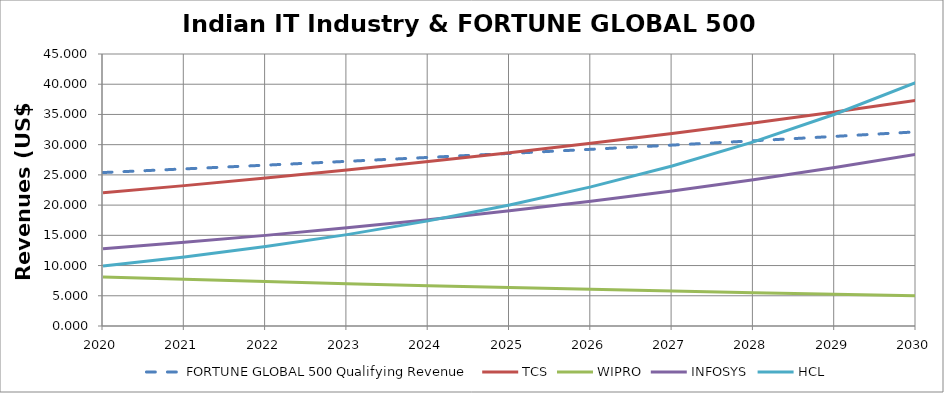
| Category | FORTUNE GLOBAL 500 Qualifying Revenue | TCS | WIPRO | INFOSYS | HCL |
|---|---|---|---|---|---|
| 2020.0 | 25.386 | 22.031 | 8.1 | 12.78 | 9.93 |
| 2021.0 | 25.99 | 23.223 | 7.719 | 13.843 | 11.423 |
| 2022.0 | 26.608 | 24.48 | 7.356 | 14.993 | 13.141 |
| 2023.0 | 27.242 | 25.805 | 7.009 | 16.24 | 15.117 |
| 2024.0 | 27.89 | 27.201 | 6.68 | 17.59 | 17.39 |
| 2025.0 | 28.553 | 28.673 | 6.365 | 19.053 | 20.005 |
| 2026.0 | 29.233 | 30.225 | 6.066 | 20.637 | 23.013 |
| 2027.0 | 29.928 | 31.86 | 5.78 | 22.353 | 26.474 |
| 2028.0 | 30.64 | 33.584 | 5.508 | 24.211 | 30.455 |
| 2029.0 | 31.37 | 35.402 | 5.249 | 26.224 | 35.034 |
| 2030.0 | 32.116 | 37.318 | 5.002 | 28.405 | 40.302 |